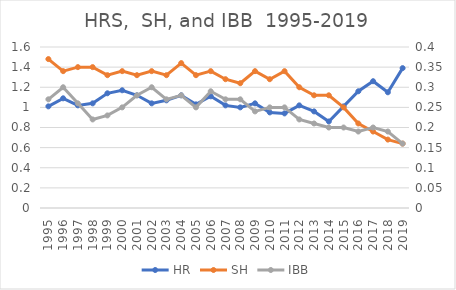
| Category | HR |
|---|---|
| 1995.0 | 1.01 |
| 1996.0 | 1.09 |
| 1997.0 | 1.02 |
| 1998.0 | 1.04 |
| 1999.0 | 1.14 |
| 2000.0 | 1.17 |
| 2001.0 | 1.12 |
| 2002.0 | 1.04 |
| 2003.0 | 1.07 |
| 2004.0 | 1.12 |
| 2005.0 | 1.03 |
| 2006.0 | 1.11 |
| 2007.0 | 1.02 |
| 2008.0 | 1 |
| 2009.0 | 1.04 |
| 2010.0 | 0.95 |
| 2011.0 | 0.94 |
| 2012.0 | 1.02 |
| 2013.0 | 0.96 |
| 2014.0 | 0.86 |
| 2015.0 | 1.01 |
| 2016.0 | 1.16 |
| 2017.0 | 1.26 |
| 2018.0 | 1.15 |
| 2019.0 | 1.39 |